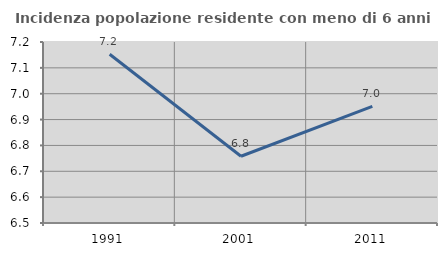
| Category | Incidenza popolazione residente con meno di 6 anni |
|---|---|
| 1991.0 | 7.152 |
| 2001.0 | 6.758 |
| 2011.0 | 6.951 |